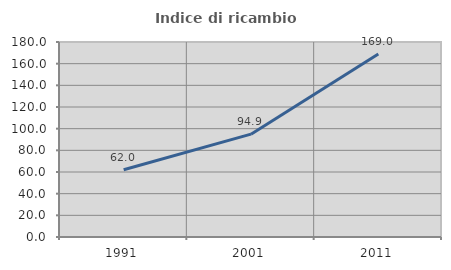
| Category | Indice di ricambio occupazionale  |
|---|---|
| 1991.0 | 62.037 |
| 2001.0 | 94.915 |
| 2011.0 | 169 |